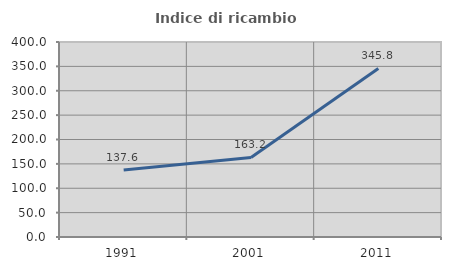
| Category | Indice di ricambio occupazionale  |
|---|---|
| 1991.0 | 137.634 |
| 2001.0 | 163.243 |
| 2011.0 | 345.794 |